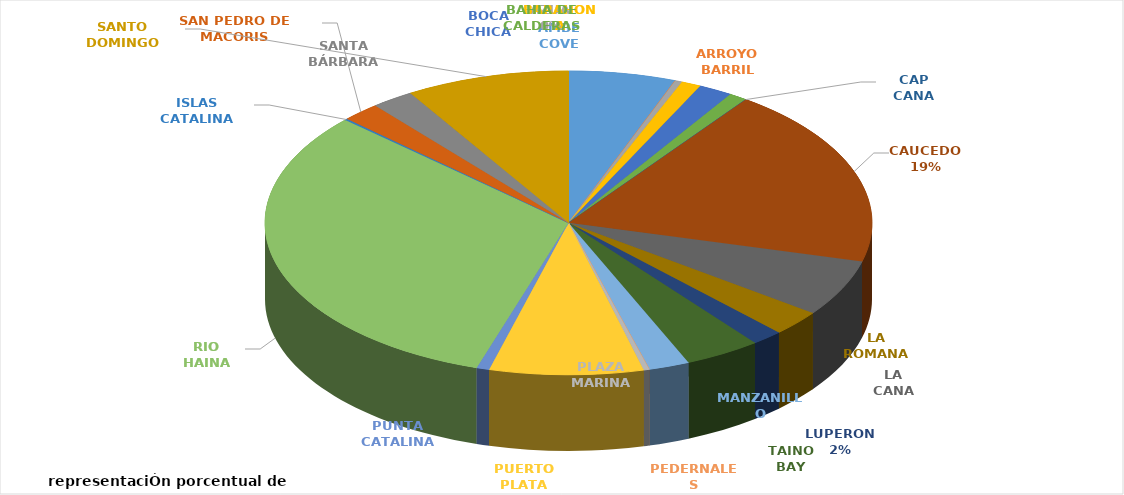
| Category | PORCENTUAL  |
|---|---|
| AMBE COVE | 0.057 |
| ARROYO BARRIL | 0 |
| AZUA | 0.004 |
| BARAHONA | 0.011 |
| BOCA CHICA | 0.018 |
| BAHIA DE CALDERAS | 0.01 |
| CAP CANA | 0 |
| CAUCEDO | 0.192 |
| LA CANA | 0.06 |
| LA ROMANA | 0.027 |
| LUPERON  | 0.017 |
| TAINO BAY | 0.041 |
| MANZANILLO | 0.022 |
| PEDERNALES | 0 |
| PLAZA MARINA | 0.003 |
| PUERTO PLATA | 0.082 |
| PUNTA CATALINA | 0.007 |
| RIO HAINA | 0.32 |
| ISLAS CATALINA | 0.002 |
| SAN PEDRO DE MACORIS | 0.02 |
| SANTA BÁRBARA | 0.023 |
| SANTO DOMINGO | 0.087 |